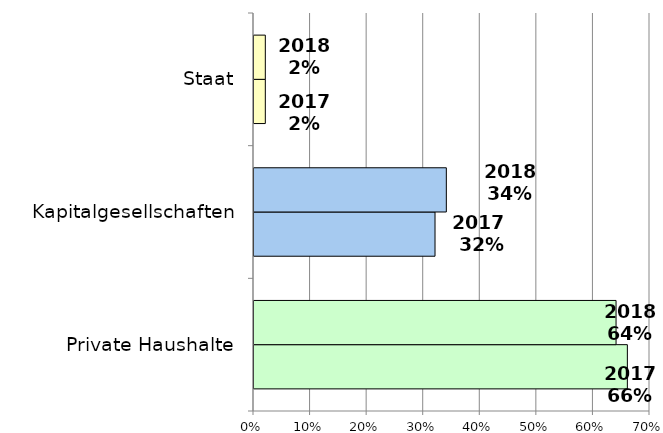
| Category | 2017 | 2018 |
|---|---|---|
| Private Haushalte | 0.66 | 0.64 |
| Kapitalgesellschaften | 0.32 | 0.34 |
| Staat | 0.02 | 0.02 |